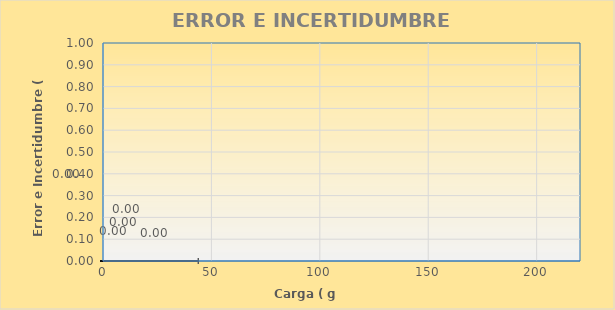
| Category | ERROR (mg) |
|---|---|
| 0.0 | 0 |
| 0.0 | 0 |
| 0.0 | 0 |
| 0.0 | 0 |
| 0.0 | 0 |